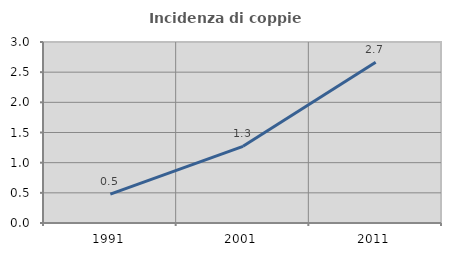
| Category | Incidenza di coppie miste |
|---|---|
| 1991.0 | 0.479 |
| 2001.0 | 1.271 |
| 2011.0 | 2.664 |